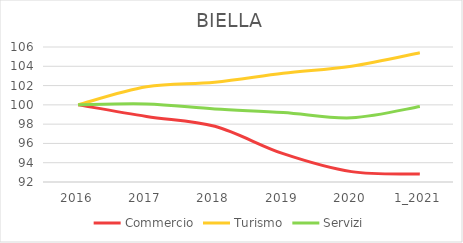
| Category | Commercio | Turismo | Servizi |
|---|---|---|---|
| 2016 | 100 | 100 | 100 |
| 2017 | 98.799 | 101.869 | 100.088 |
| 2018 | 97.778 | 102.336 | 99.576 |
| 2019 | 94.936 | 103.271 | 99.205 |
| 2020 | 93.074 | 104.005 | 98.657 |
| 1_2021 | 92.834 | 105.407 | 99.823 |